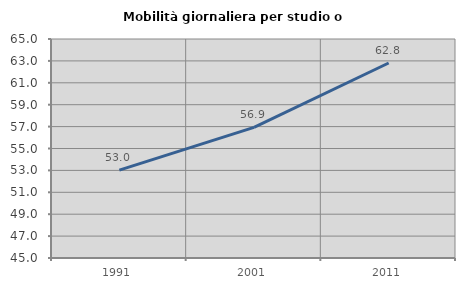
| Category | Mobilità giornaliera per studio o lavoro |
|---|---|
| 1991.0 | 53.025 |
| 2001.0 | 56.923 |
| 2011.0 | 62.81 |